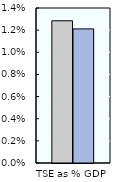
| Category | 2000-02 | 2018-20 |
|---|---|---|
| TSE as % GDP | 0.013 | 0.012 |